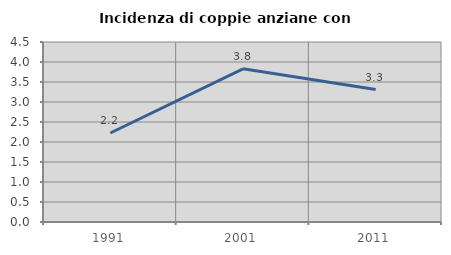
| Category | Incidenza di coppie anziane con figli |
|---|---|
| 1991.0 | 2.225 |
| 2001.0 | 3.829 |
| 2011.0 | 3.311 |